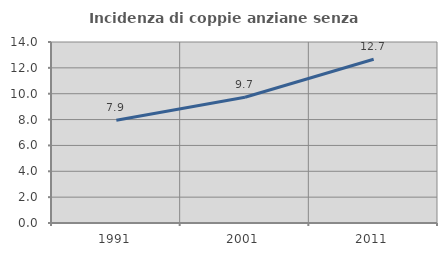
| Category | Incidenza di coppie anziane senza figli  |
|---|---|
| 1991.0 | 7.94 |
| 2001.0 | 9.724 |
| 2011.0 | 12.662 |